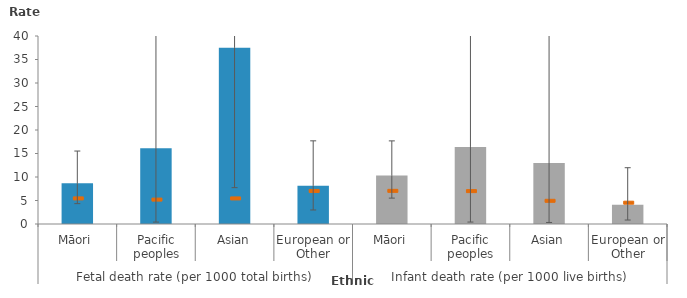
| Category | 1 |
|---|---|
| 0 | 8.675 |
| 1 | 16.129 |
| 2 | 37.5 |
| 3 | 8.13 |
| 4 | 10.342 |
| 5 | 16.393 |
| 6 | 12.987 |
| 7 | 4.098 |